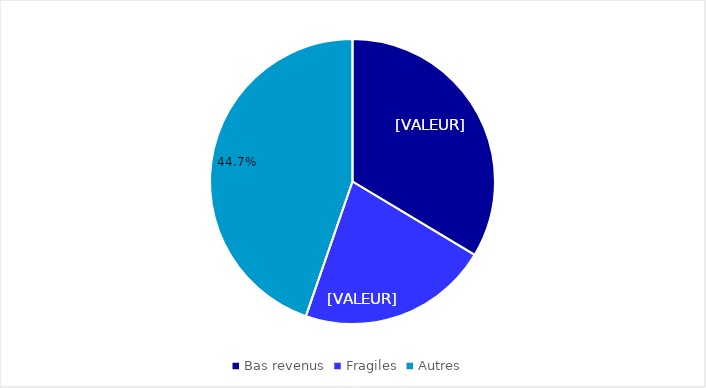
| Category | Series 0 |
|---|---|
| Bas revenus  | 0.336 |
| Fragiles  | 0.217 |
| Autres  | 0.447 |